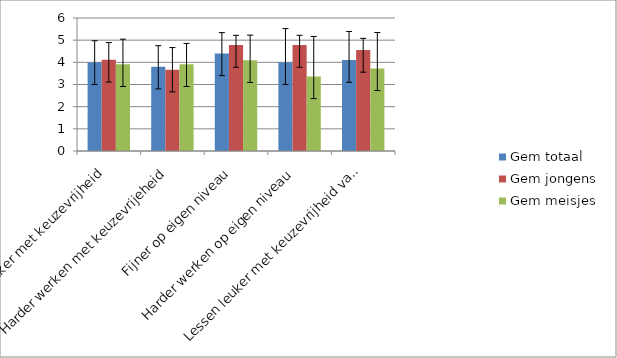
| Category | Gem totaal | Gem jongens | Gem meisjes |
|---|---|---|---|
| Leuker met keuzevrijheid | 4 | 4.111 | 3.909 |
| Harder werken met keuzevrijeheid | 3.8 | 3.667 | 3.909 |
| Fijner op eigen niveau | 4.4 | 4.778 | 4.091 |
| Harder werken op eigen niveau | 4 | 4.778 | 3.364 |
| Lessen leuker met keuzevrijheid van niveau | 4.1 | 4.556 | 3.727 |